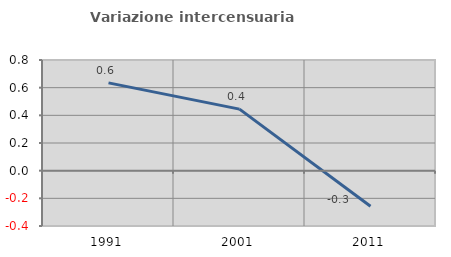
| Category | Variazione intercensuaria annua |
|---|---|
| 1991.0 | 0.635 |
| 2001.0 | 0.445 |
| 2011.0 | -0.257 |